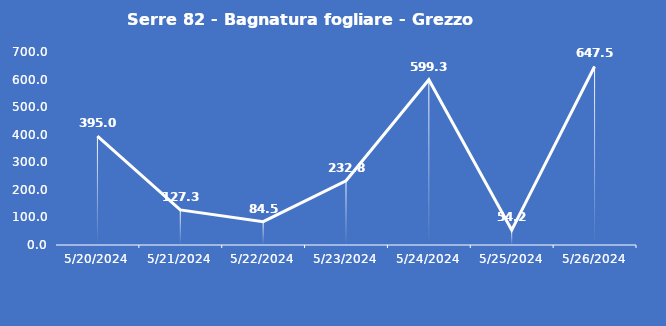
| Category | Serre 82 - Bagnatura fogliare - Grezzo (min) |
|---|---|
| 5/20/24 | 395 |
| 5/21/24 | 127.3 |
| 5/22/24 | 84.5 |
| 5/23/24 | 232.8 |
| 5/24/24 | 599.3 |
| 5/25/24 | 54.2 |
| 5/26/24 | 647.5 |